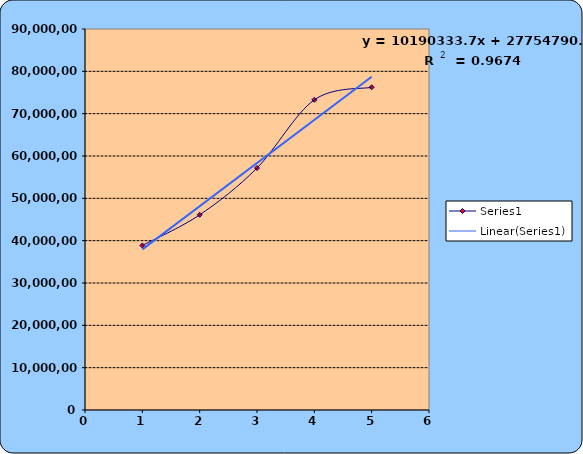
| Category | Series 0 |
|---|---|
| 1.0 | 38863949 |
| 2.0 | 46102914 |
| 3.0 | 57160945 |
| 4.0 | 73268149 |
| 5.0 | 76233000 |